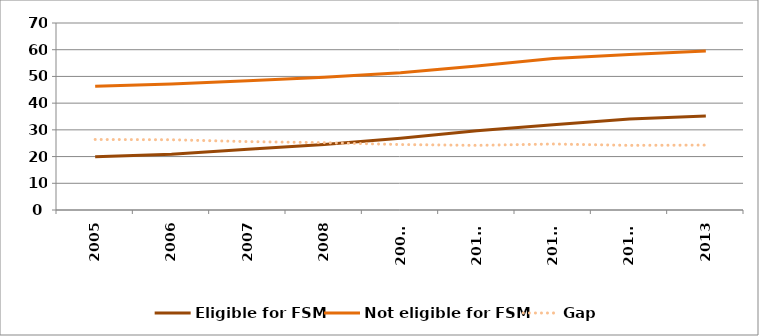
| Category | Eligible for FSM | Not eligible for FSM | Gap |
|---|---|---|---|
| 2005 | 19.9 | 46.3 | 26.4 |
| 2006 | 20.9 | 47.2 | 26.3 |
| 2007 | 22.7 | 48.4 | 25.6 |
| 2008 | 24.5 | 49.7 | 25.2 |
| 2009r | 26.9 | 51.4 | 24.5 |
| 2010r | 29.7 | 53.9 | 24.2 |
| 2011r | 31.9 | 56.7 | 24.7 |
| 2012r | 34.1 | 58.2 | 24.2 |
| 2013 | 35.2 | 59.5 | 24.3 |